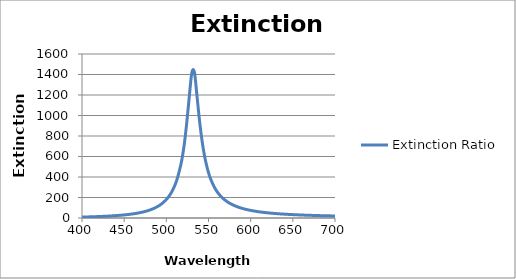
| Category | Extinction Ratio |
|---|---|
| 400.0 | 9.216 |
| 403.03 | 9.827 |
| 406.06 | 10.475 |
| 409.09 | 11.182 |
| 412.12 | 11.961 |
| 415.15 | 12.787 |
| 418.18 | 13.697 |
| 421.21 | 14.666 |
| 424.24 | 15.736 |
| 427.27 | 16.876 |
| 430.3 | 18.139 |
| 433.33 | 19.487 |
| 436.36 | 21.048 |
| 439.39 | 22.655 |
| 442.42 | 24.529 |
| 445.45 | 26.546 |
| 448.48 | 28.716 |
| 451.52 | 31.268 |
| 454.55 | 34.04 |
| 457.58 | 37.043 |
| 460.61 | 40.452 |
| 463.64 | 44.345 |
| 466.67 | 48.817 |
| 469.7 | 53.736 |
| 472.73 | 59.426 |
| 475.76 | 66.054 |
| 478.79 | 73.437 |
| 481.82 | 82.114 |
| 484.85 | 92.402 |
| 487.88 | 104.055 |
| 490.91 | 118.02 |
| 493.94 | 134.963 |
| 496.97 | 155.774 |
| 500.0 | 180.208 |
| 503.03 | 210.736 |
| 506.06 | 249.571 |
| 509.09 | 299.915 |
| 512.12 | 362.352 |
| 515.15 | 451.214 |
| 518.18 | 558.657 |
| 521.21 | 715.299 |
| 524.24 | 931.582 |
| 527.27 | 1189.564 |
| 530.3 | 1419.639 |
| 533.33 | 1419.618 |
| 536.36 | 1189.564 |
| 539.39 | 946.365 |
| 542.42 | 748.725 |
| 545.45 | 599.487 |
| 548.48 | 487.787 |
| 551.52 | 403.289 |
| 554.55 | 342.163 |
| 557.58 | 290.546 |
| 560.61 | 252.03 |
| 563.64 | 220.575 |
| 566.67 | 194.583 |
| 569.7 | 174.3 |
| 572.73 | 155.773 |
| 575.76 | 141.064 |
| 578.79 | 128.323 |
| 581.82 | 117.217 |
| 584.85 | 107.48 |
| 587.88 | 98.898 |
| 590.91 | 91.843 |
| 593.94 | 85.016 |
| 596.97 | 79.358 |
| 600.0 | 74.244 |
| 603.03 | 69.601 |
| 606.06 | 65.378 |
| 609.09 | 61.521 |
| 612.12 | 58.276 |
| 615.15 | 55.015 |
| 618.18 | 52.258 |
| 621.21 | 49.701 |
| 624.24 | 47.119 |
| 627.27 | 44.918 |
| 630.3 | 43.048 |
| 633.33 | 41.121 |
| 636.36 | 39.319 |
| 639.39 | 37.779 |
| 642.42 | 36.187 |
| 645.45 | 34.822 |
| 648.48 | 33.533 |
| 651.52 | 32.312 |
| 654.55 | 31.155 |
| 657.58 | 30.059 |
| 660.61 | 29.018 |
| 663.64 | 28.029 |
| 666.67 | 27.18 |
| 669.7 | 26.28 |
| 672.73 | 25.507 |
| 675.76 | 24.687 |
| 678.79 | 23.982 |
| 681.82 | 23.306 |
| 684.85 | 22.655 |
| 687.88 | 22.033 |
| 690.91 | 21.434 |
| 693.94 | 20.858 |
| 696.97 | 20.366 |
| 700.0 | 19.832 |